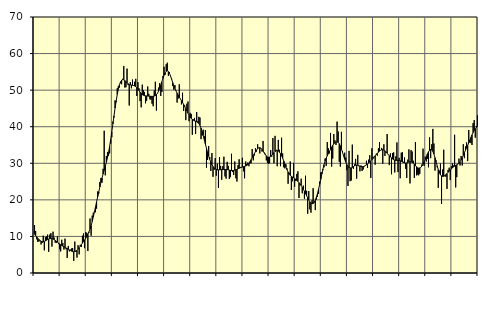
| Category | Piggar | Series 1 |
|---|---|---|
| nan | 13.1 | 10.64 |
| 87.0 | 11.5 | 10.17 |
| 87.0 | 9.2 | 9.88 |
| 87.0 | 8.5 | 9.48 |
| 87.0 | 8.6 | 9.15 |
| 87.0 | 9 | 8.87 |
| 87.0 | 7.8 | 8.69 |
| 87.0 | 8.2 | 8.57 |
| 87.0 | 10.2 | 8.55 |
| 87.0 | 6.2 | 8.63 |
| 87.0 | 9.8 | 8.77 |
| 87.0 | 10 | 8.96 |
| nan | 10.5 | 9.14 |
| 88.0 | 5.8 | 9.29 |
| 88.0 | 10.5 | 9.4 |
| 88.0 | 10.9 | 9.45 |
| 88.0 | 7.2 | 9.42 |
| 88.0 | 11.3 | 9.31 |
| 88.0 | 9.7 | 9.13 |
| 88.0 | 8.3 | 8.92 |
| 88.0 | 8.2 | 8.68 |
| 88.0 | 10 | 8.44 |
| 88.0 | 7.9 | 8.2 |
| 88.0 | 6.5 | 7.96 |
| nan | 5.9 | 7.73 |
| 89.0 | 9.1 | 7.53 |
| 89.0 | 8.2 | 7.35 |
| 89.0 | 6.4 | 7.18 |
| 89.0 | 9.4 | 7.01 |
| 89.0 | 6.5 | 6.84 |
| 89.0 | 4.1 | 6.67 |
| 89.0 | 7.4 | 6.49 |
| 89.0 | 5.9 | 6.32 |
| 89.0 | 6.4 | 6.15 |
| 89.0 | 6.7 | 5.99 |
| 89.0 | 6.8 | 5.88 |
| nan | 3.3 | 5.84 |
| 90.0 | 8.6 | 5.87 |
| 90.0 | 5.8 | 6 |
| 90.0 | 4.2 | 6.23 |
| 90.0 | 7.6 | 6.53 |
| 90.0 | 5.1 | 6.9 |
| 90.0 | 7.7 | 7.31 |
| 90.0 | 7.1 | 7.75 |
| 90.0 | 10.2 | 8.17 |
| 90.0 | 10.8 | 8.59 |
| 90.0 | 6.8 | 9.03 |
| 90.0 | 11.2 | 9.49 |
| nan | 11 | 10 |
| 91.0 | 6 | 10.58 |
| 91.0 | 11 | 11.25 |
| 91.0 | 14.9 | 12.04 |
| 91.0 | 10.2 | 12.99 |
| 91.0 | 15.7 | 14.08 |
| 91.0 | 16.5 | 15.32 |
| 91.0 | 16.9 | 16.66 |
| 91.0 | 16.6 | 18.05 |
| 91.0 | 17.6 | 19.44 |
| 91.0 | 22.3 | 20.83 |
| 91.0 | 21.7 | 22.19 |
| nan | 24.9 | 23.52 |
| 92.0 | 26 | 24.78 |
| 92.0 | 24.7 | 25.98 |
| 92.0 | 28.5 | 27.09 |
| 92.0 | 38.9 | 28.14 |
| 92.0 | 26.7 | 29.19 |
| 92.0 | 32 | 30.28 |
| 92.0 | 33.1 | 31.51 |
| 92.0 | 32 | 32.95 |
| 92.0 | 32.7 | 34.63 |
| 92.0 | 35.4 | 36.54 |
| 92.0 | 37.1 | 38.61 |
| nan | 41.4 | 40.78 |
| 93.0 | 42.5 | 42.97 |
| 93.0 | 47.2 | 45.09 |
| 93.0 | 46.7 | 47.06 |
| 93.0 | 50.5 | 48.81 |
| 93.0 | 51.1 | 50.29 |
| 93.0 | 50.7 | 51.45 |
| 93.0 | 51.9 | 52.25 |
| 93.0 | 51.6 | 52.7 |
| 93.0 | 53.1 | 52.87 |
| 93.0 | 56.6 | 52.81 |
| 93.0 | 50.7 | 52.61 |
| nan | 50.8 | 52.32 |
| 94.0 | 55.9 | 52.02 |
| 94.0 | 51.4 | 51.75 |
| 94.0 | 45.8 | 51.56 |
| 94.0 | 52.2 | 51.45 |
| 94.0 | 50.5 | 51.38 |
| 94.0 | 52.9 | 51.32 |
| 94.0 | 51.3 | 51.25 |
| 94.0 | 52.3 | 51.14 |
| 94.0 | 53.1 | 50.94 |
| 94.0 | 48.4 | 50.65 |
| 94.0 | 52.2 | 50.27 |
| nan | 50.5 | 49.85 |
| 95.0 | 47 | 49.44 |
| 95.0 | 45.3 | 49.07 |
| 95.0 | 51.5 | 48.79 |
| 95.0 | 50 | 48.6 |
| 95.0 | 49.5 | 48.49 |
| 95.0 | 46.4 | 48.44 |
| 95.0 | 47.1 | 48.42 |
| 95.0 | 51 | 48.39 |
| 95.0 | 49 | 48.35 |
| 95.0 | 47.5 | 48.32 |
| 95.0 | 47.4 | 48.31 |
| nan | 46.3 | 48.29 |
| 96.0 | 45.6 | 48.3 |
| 96.0 | 49.9 | 48.38 |
| 96.0 | 52.3 | 48.53 |
| 96.0 | 44.4 | 48.77 |
| 96.0 | 49.2 | 49.16 |
| 96.0 | 50.7 | 49.73 |
| 96.0 | 51.9 | 50.47 |
| 96.0 | 48.4 | 51.35 |
| 96.0 | 49.5 | 52.29 |
| 96.0 | 53.9 | 53.22 |
| 96.0 | 56.4 | 54.07 |
| nan | 54.2 | 54.74 |
| 97.0 | 57.1 | 55.17 |
| 97.0 | 57.5 | 55.3 |
| 97.0 | 53.9 | 55.08 |
| 97.0 | 54.9 | 54.57 |
| 97.0 | 53.8 | 53.85 |
| 97.0 | 53.1 | 52.98 |
| 97.0 | 51.1 | 52.05 |
| 97.0 | 50.1 | 51.19 |
| 97.0 | 51.4 | 50.43 |
| 97.0 | 49.9 | 49.77 |
| 97.0 | 46.6 | 49.18 |
| nan | 47.7 | 48.64 |
| 98.0 | 51.6 | 48.12 |
| 98.0 | 47.6 | 47.63 |
| 98.0 | 46.1 | 47.13 |
| 98.0 | 49.3 | 46.62 |
| 98.0 | 44.3 | 46.09 |
| 98.0 | 45.8 | 45.53 |
| 98.0 | 41.8 | 44.93 |
| 98.0 | 46.3 | 44.31 |
| 98.0 | 46.9 | 43.68 |
| 98.0 | 41.5 | 43.11 |
| 98.0 | 43.8 | 42.64 |
| nan | 43.5 | 42.27 |
| 99.0 | 37.8 | 42 |
| 99.0 | 42 | 41.76 |
| 99.0 | 42.4 | 41.6 |
| 99.0 | 38 | 41.49 |
| 99.0 | 44 | 41.36 |
| 99.0 | 41.5 | 41.16 |
| 99.0 | 42.7 | 40.85 |
| 99.0 | 42.5 | 40.35 |
| 99.0 | 36.6 | 39.65 |
| 99.0 | 37.6 | 38.75 |
| 99.0 | 39.2 | 37.68 |
| nan | 37.4 | 36.49 |
| 0.0 | 39.1 | 35.27 |
| 0.0 | 28.8 | 34.09 |
| 0.0 | 30.9 | 32.98 |
| 0.0 | 34.7 | 31.97 |
| 0.0 | 31.7 | 31.08 |
| 0.0 | 27.9 | 30.31 |
| 0.0 | 32.8 | 29.66 |
| 0.0 | 26.3 | 29.13 |
| 0.0 | 28.2 | 28.74 |
| 0.0 | 31.4 | 28.49 |
| 0.0 | 26.6 | 28.33 |
| nan | 29.9 | 28.23 |
| 1.0 | 23.3 | 28.21 |
| 1.0 | 31.7 | 28.21 |
| 1.0 | 29.3 | 28.25 |
| 1.0 | 25.5 | 28.29 |
| 1.0 | 29.2 | 28.29 |
| 1.0 | 31.8 | 28.29 |
| 1.0 | 26.4 | 28.3 |
| 1.0 | 25.8 | 28.3 |
| 1.0 | 30.4 | 28.28 |
| 1.0 | 29.3 | 28.22 |
| 1.0 | 25.7 | 28.14 |
| nan | 26.2 | 28.06 |
| 2.0 | 32.6 | 28 |
| 2.0 | 27.6 | 28.01 |
| 2.0 | 26.8 | 28.04 |
| 2.0 | 30.5 | 28.12 |
| 2.0 | 25.9 | 28.24 |
| 2.0 | 25 | 28.36 |
| 2.0 | 29.5 | 28.49 |
| 2.0 | 31.1 | 28.64 |
| 2.0 | 29 | 28.77 |
| 2.0 | 28.8 | 28.88 |
| 2.0 | 31.5 | 28.97 |
| nan | 27.8 | 29.07 |
| 3.0 | 25.9 | 29.16 |
| 3.0 | 30.5 | 29.25 |
| 3.0 | 29.8 | 29.4 |
| 3.0 | 30.2 | 29.64 |
| 3.0 | 29.2 | 29.99 |
| 3.0 | 30 | 30.46 |
| 3.0 | 30 | 31 |
| 3.0 | 33.9 | 31.55 |
| 3.0 | 30.8 | 32.11 |
| 3.0 | 32.1 | 32.65 |
| 3.0 | 34.1 | 33.16 |
| nan | 33.2 | 33.61 |
| 4.0 | 35.2 | 34 |
| 4.0 | 34.3 | 34.24 |
| 4.0 | 32.7 | 34.29 |
| 4.0 | 34.1 | 34.14 |
| 4.0 | 33.2 | 33.81 |
| 4.0 | 36.1 | 33.37 |
| 4.0 | 33 | 32.87 |
| 4.0 | 32.6 | 32.4 |
| 4.0 | 30.8 | 32.01 |
| 4.0 | 30.1 | 31.75 |
| 4.0 | 29.8 | 31.65 |
| nan | 30 | 31.7 |
| 5.0 | 33.6 | 31.88 |
| 5.0 | 31.8 | 32.16 |
| 5.0 | 36.9 | 32.53 |
| 5.0 | 30 | 32.91 |
| 5.0 | 37.5 | 33.22 |
| 5.0 | 33.7 | 33.43 |
| 5.0 | 29.2 | 33.48 |
| 5.0 | 36.4 | 33.35 |
| 5.0 | 33.7 | 33.06 |
| 5.0 | 29.2 | 32.63 |
| 5.0 | 37 | 32.07 |
| nan | 32.7 | 31.4 |
| 6.0 | 28.9 | 30.65 |
| 6.0 | 28.6 | 29.84 |
| 6.0 | 29.7 | 29.02 |
| 6.0 | 28.6 | 28.25 |
| 6.0 | 24.4 | 27.6 |
| 6.0 | 27.4 | 27.08 |
| 6.0 | 30.5 | 26.71 |
| 6.0 | 22.7 | 26.45 |
| 6.0 | 25.1 | 26.25 |
| 6.0 | 30.1 | 26.07 |
| 6.0 | 23.6 | 25.86 |
| nan | 25.2 | 25.61 |
| 7.0 | 27.1 | 25.32 |
| 7.0 | 27.8 | 25.02 |
| 7.0 | 20.5 | 24.7 |
| 7.0 | 24 | 24.35 |
| 7.0 | 25.8 | 23.94 |
| 7.0 | 21.8 | 23.45 |
| 7.0 | 23.9 | 22.9 |
| 7.0 | 20.3 | 22.32 |
| 7.0 | 26.6 | 21.73 |
| 7.0 | 22.5 | 21.13 |
| 7.0 | 16.2 | 20.54 |
| nan | 22.4 | 19.98 |
| 8.0 | 17.4 | 19.48 |
| 8.0 | 16.5 | 19.1 |
| 8.0 | 19.9 | 18.92 |
| 8.0 | 23.2 | 18.98 |
| 8.0 | 19.2 | 19.3 |
| 8.0 | 17.2 | 19.87 |
| 8.0 | 20.1 | 20.7 |
| 8.0 | 20.8 | 21.74 |
| 8.0 | 21.6 | 22.93 |
| 8.0 | 25 | 24.23 |
| 8.0 | 27.5 | 25.63 |
| nan | 27.6 | 27.05 |
| 9.0 | 28.1 | 28.39 |
| 9.0 | 28.9 | 29.6 |
| 9.0 | 31.3 | 30.62 |
| 9.0 | 29.3 | 31.41 |
| 9.0 | 35.8 | 32.05 |
| 9.0 | 34.1 | 32.66 |
| 9.0 | 32.7 | 33.25 |
| 9.0 | 38.3 | 33.83 |
| 9.0 | 29.1 | 34.4 |
| 9.0 | 31.3 | 34.91 |
| 9.0 | 38 | 35.32 |
| nan | 36.3 | 35.63 |
| 10.0 | 35 | 35.83 |
| 10.0 | 41.4 | 35.86 |
| 10.0 | 38.7 | 35.71 |
| 10.0 | 30.4 | 35.35 |
| 10.0 | 29.1 | 34.76 |
| 10.0 | 38.6 | 33.95 |
| 10.0 | 33.3 | 33.02 |
| 10.0 | 32.2 | 32.02 |
| 10.0 | 32.9 | 31.08 |
| 10.0 | 31.6 | 30.28 |
| 10.0 | 28.1 | 29.64 |
| nan | 23.8 | 29.17 |
| 11.0 | 33.4 | 28.88 |
| 11.0 | 25.1 | 28.74 |
| 11.0 | 25.3 | 28.74 |
| 11.0 | 35.1 | 28.87 |
| 11.0 | 28.5 | 29.1 |
| 11.0 | 29.7 | 29.33 |
| 11.0 | 31.2 | 29.47 |
| 11.0 | 25.8 | 29.52 |
| 11.0 | 32.3 | 29.46 |
| 11.0 | 29.2 | 29.34 |
| 11.0 | 27.8 | 29.2 |
| nan | 29.4 | 29.1 |
| 12.0 | 27.9 | 29.05 |
| 12.0 | 28.3 | 29.07 |
| 12.0 | 29.1 | 29.19 |
| 12.0 | 29.3 | 29.38 |
| 12.0 | 30.7 | 29.59 |
| 12.0 | 28.7 | 29.82 |
| 12.0 | 31 | 30.06 |
| 12.0 | 32.2 | 30.32 |
| 12.0 | 26 | 30.62 |
| 12.0 | 34.1 | 30.94 |
| 12.0 | 31.8 | 31.3 |
| nan | 31.7 | 31.69 |
| 13.0 | 29.6 | 32.06 |
| 13.0 | 32.6 | 32.41 |
| 13.0 | 32.1 | 32.74 |
| 13.0 | 34.1 | 33.04 |
| 13.0 | 35.8 | 33.32 |
| 13.0 | 33.5 | 33.55 |
| 13.0 | 34.2 | 33.68 |
| 13.0 | 29.9 | 33.71 |
| 13.0 | 35.2 | 33.63 |
| 13.0 | 32 | 33.43 |
| 13.0 | 32.9 | 33.12 |
| nan | 38 | 32.76 |
| 14.0 | 32.5 | 32.41 |
| 14.0 | 29.5 | 32.08 |
| 14.0 | 32.7 | 31.76 |
| 14.0 | 27 | 31.46 |
| 14.0 | 32.8 | 31.18 |
| 14.0 | 33 | 30.95 |
| 14.0 | 27.5 | 30.83 |
| 14.0 | 31.9 | 30.8 |
| 14.0 | 35.7 | 30.8 |
| 14.0 | 27.6 | 30.82 |
| 14.0 | 31.5 | 30.8 |
| nan | 25.9 | 30.7 |
| 15.0 | 32.9 | 30.53 |
| 15.0 | 33 | 30.35 |
| 15.0 | 30.4 | 30.2 |
| 15.0 | 31.6 | 30.09 |
| 15.0 | 28.5 | 30.07 |
| 15.0 | 26 | 30.12 |
| 15.0 | 31 | 30.23 |
| 15.0 | 33.8 | 30.36 |
| 15.0 | 24.5 | 30.43 |
| 15.0 | 33.6 | 30.39 |
| 15.0 | 33.2 | 30.26 |
| nan | 30.7 | 30.03 |
| 16.0 | 26 | 29.73 |
| 16.0 | 35.8 | 29.37 |
| 16.0 | 26.7 | 29.04 |
| 16.0 | 26.9 | 28.79 |
| 16.0 | 26.7 | 28.67 |
| 16.0 | 27.1 | 28.73 |
| 16.0 | 28.9 | 28.93 |
| 16.0 | 29.7 | 29.25 |
| 16.0 | 34 | 29.72 |
| 16.0 | 29.3 | 30.33 |
| 16.0 | 31.8 | 31.03 |
| nan | 30.5 | 31.78 |
| 17.0 | 31.2 | 32.52 |
| 17.0 | 28.9 | 33.13 |
| 17.0 | 37.1 | 33.57 |
| 17.0 | 31.4 | 33.79 |
| 17.0 | 35.2 | 33.69 |
| 17.0 | 39.4 | 33.25 |
| 17.0 | 35.4 | 32.5 |
| 17.0 | 28 | 31.53 |
| 17.0 | 30.8 | 30.43 |
| 17.0 | 28.9 | 29.29 |
| 17.0 | 23.3 | 28.27 |
| nan | 28 | 27.44 |
| 18.0 | 29.9 | 26.86 |
| 18.0 | 18.9 | 26.54 |
| 18.0 | 28.3 | 26.41 |
| 18.0 | 33.7 | 26.45 |
| 18.0 | 26.5 | 26.63 |
| 18.0 | 26.3 | 26.9 |
| 18.0 | 23 | 27.19 |
| 18.0 | 28.2 | 27.51 |
| 18.0 | 28.8 | 27.84 |
| 18.0 | 25.4 | 28.16 |
| 18.0 | 29.2 | 28.47 |
| nan | 30 | 28.76 |
| 19.0 | 29.4 | 29 |
| 19.0 | 37.8 | 29.21 |
| 19.0 | 23.4 | 29.42 |
| 19.0 | 26.2 | 29.58 |
| 19.0 | 29.9 | 29.76 |
| 19.0 | 31.3 | 30.02 |
| 19.0 | 29.4 | 30.41 |
| 19.0 | 32 | 30.93 |
| 19.0 | 29.4 | 31.51 |
| 19.0 | 35.2 | 32.17 |
| 19.0 | 31.4 | 32.88 |
| nan | 34.6 | 33.57 |
| 20.0 | 35.7 | 34.24 |
| 20.0 | 30.6 | 34.91 |
| 20.0 | 39.1 | 35.59 |
| 20.0 | 35.7 | 36.32 |
| 20.0 | 35.5 | 37.06 |
| 20.0 | 35 | 37.77 |
| 20.0 | 41 | 38.42 |
| 20.0 | 41.8 | 39 |
| 20.0 | 37 | 39.47 |
| 20.0 | 40.2 | 39.82 |
| 20.0 | 43.1 | 40.03 |